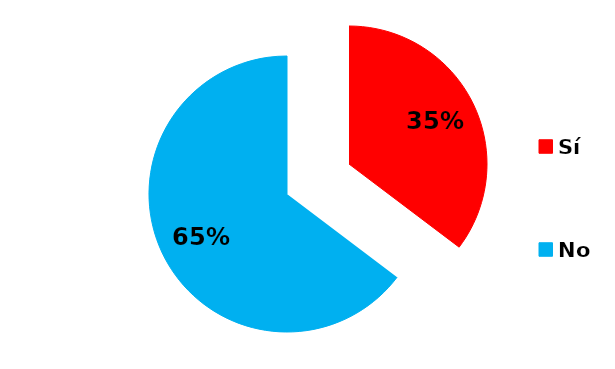
| Category | Series 0 |
|---|---|
| Sí | 6 |
| No | 11 |